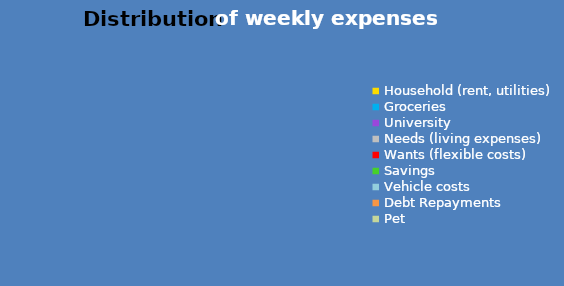
| Category | Series 0 |
|---|---|
| Household (rent, utilities) | 0 |
| Groceries | 0 |
| University | 0 |
| Needs (living expenses) | 0 |
| Wants (flexible costs) | 0 |
| Savings | 0 |
| Vehicle costs | 0 |
| Debt Repayments | 0 |
| Pet  | 0 |